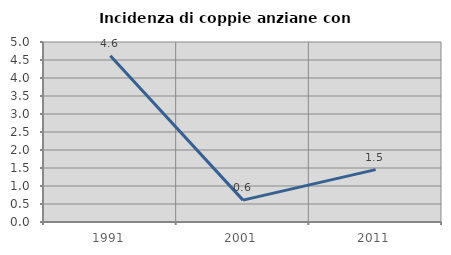
| Category | Incidenza di coppie anziane con figli |
|---|---|
| 1991.0 | 4.615 |
| 2001.0 | 0.608 |
| 2011.0 | 1.455 |